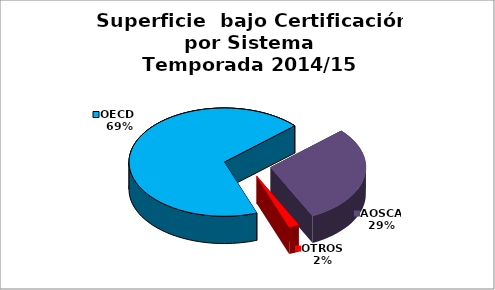
| Category | Series 0 |
|---|---|
| OECD  | 7034.1 |
| AOSCA | 3008.95 |
| OTROS | 176.5 |